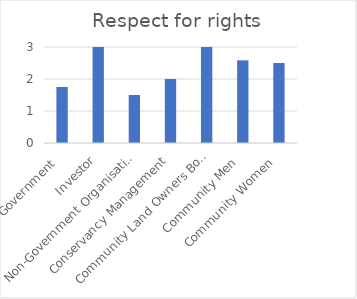
| Category | Respect for rights |
|---|---|
| Government  | 1.75 |
| Investor | 3 |
| Non-Government Organisations | 1.5 |
| Conservancy Management | 2 |
| Community Land Owners Board | 3 |
| Community Men  | 2.583 |
| Community Women  | 2.5 |